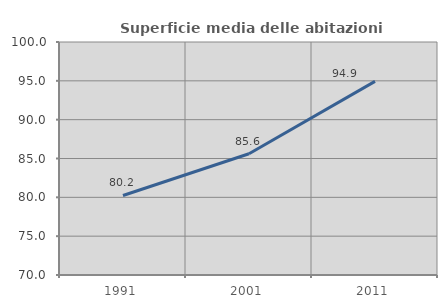
| Category | Superficie media delle abitazioni occupate |
|---|---|
| 1991.0 | 80.239 |
| 2001.0 | 85.615 |
| 2011.0 | 94.936 |